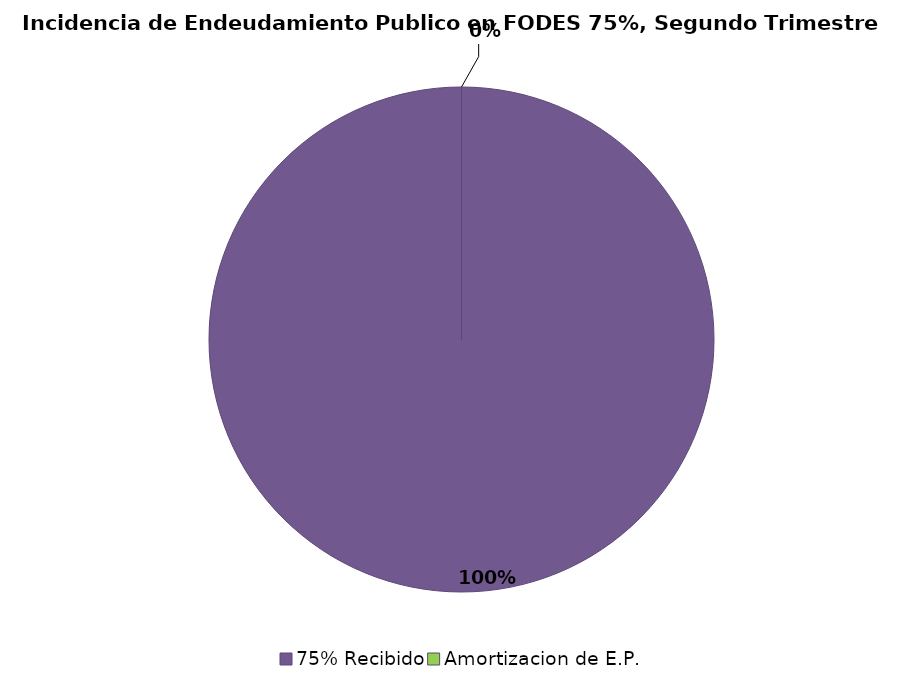
| Category | Series 0 |
|---|---|
| 75% Recibido | 1 |
| Amortizacion de E.P. | 0 |